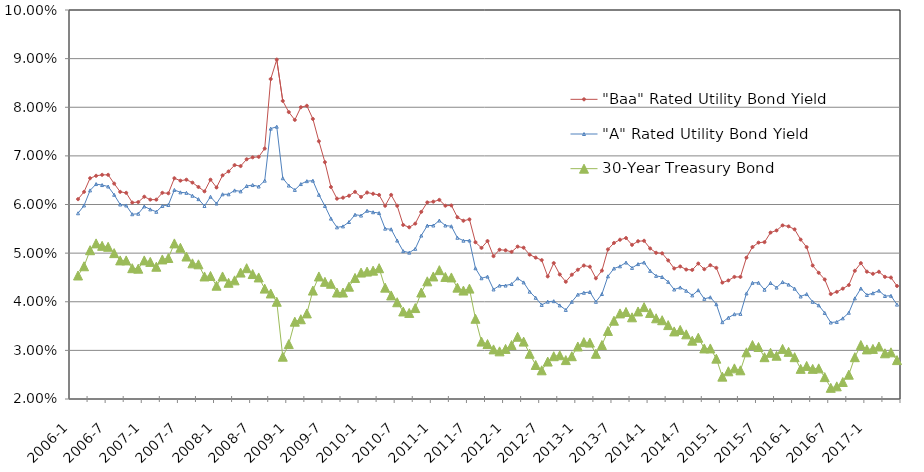
| Category | "Baa" Rated Utility Bond Yield | "A" Rated Utility Bond Yield | 30-Year Treasury Bond |
|---|---|---|---|
| 2006-02-01 | 0.061 | 0.058 | 0.045 |
| 2006-03-01 | 0.063 | 0.06 | 0.047 |
| 2006-04-01 | 0.065 | 0.063 | 0.051 |
| 2006-05-01 | 0.066 | 0.064 | 0.052 |
| 2006-06-01 | 0.066 | 0.064 | 0.052 |
| 2006-07-01 | 0.066 | 0.064 | 0.051 |
| 2006-08-01 | 0.064 | 0.062 | 0.05 |
| 2006-09-01 | 0.063 | 0.06 | 0.048 |
| 2006-10-01 | 0.062 | 0.06 | 0.048 |
| 2006-11-01 | 0.06 | 0.058 | 0.047 |
| 2006-12-01 | 0.06 | 0.058 | 0.047 |
| 2007-01-01 | 0.062 | 0.06 | 0.048 |
| 2007-02-01 | 0.061 | 0.059 | 0.048 |
| 2007-03-01 | 0.061 | 0.058 | 0.047 |
| 2007-04-01 | 0.062 | 0.06 | 0.049 |
| 2007-05-01 | 0.062 | 0.06 | 0.049 |
| 2007-06-01 | 0.065 | 0.063 | 0.052 |
| 2007-07-01 | 0.065 | 0.062 | 0.051 |
| 2007-08-01 | 0.065 | 0.062 | 0.049 |
| 2007-09-01 | 0.064 | 0.062 | 0.048 |
| 2007-10-01 | 0.064 | 0.061 | 0.048 |
| 2007-11-01 | 0.063 | 0.06 | 0.045 |
| 2007-12-01 | 0.065 | 0.062 | 0.045 |
| 2008-01-01 | 0.064 | 0.06 | 0.043 |
| 2008-02-01 | 0.066 | 0.062 | 0.045 |
| 2008-03-01 | 0.067 | 0.062 | 0.044 |
| 2008-04-01 | 0.068 | 0.063 | 0.044 |
| 2008-05-01 | 0.068 | 0.063 | 0.046 |
| 2008-06-01 | 0.069 | 0.064 | 0.047 |
| 2008-07-01 | 0.07 | 0.064 | 0.046 |
| 2008-08-01 | 0.07 | 0.064 | 0.045 |
| 2008-09-01 | 0.072 | 0.065 | 0.043 |
| 2008-10-01 | 0.086 | 0.076 | 0.042 |
| 2008-11-01 | 0.09 | 0.076 | 0.04 |
| 2008-12-01 | 0.081 | 0.065 | 0.029 |
| 2009-01-01 | 0.079 | 0.064 | 0.031 |
| 2009-02-01 | 0.077 | 0.063 | 0.036 |
| 2009-03-01 | 0.08 | 0.064 | 0.036 |
| 2009-04-01 | 0.08 | 0.065 | 0.038 |
| 2009-05-01 | 0.078 | 0.065 | 0.042 |
| 2009-06-01 | 0.073 | 0.062 | 0.045 |
| 2009-07-01 | 0.069 | 0.06 | 0.044 |
| 2009-08-01 | 0.064 | 0.057 | 0.044 |
| 2009-09-01 | 0.061 | 0.055 | 0.042 |
| 2009-10-01 | 0.061 | 0.056 | 0.042 |
| 2009-11-01 | 0.062 | 0.056 | 0.043 |
| 2009-12-01 | 0.063 | 0.058 | 0.045 |
| 2010-01-01 | 0.062 | 0.058 | 0.046 |
| 2010-02-01 | 0.062 | 0.059 | 0.046 |
| 2010-03-01 | 0.062 | 0.058 | 0.046 |
| 2010-04-01 | 0.062 | 0.058 | 0.047 |
| 2010-05-01 | 0.06 | 0.055 | 0.043 |
| 2010-06-01 | 0.062 | 0.055 | 0.041 |
| 2010-07-01 | 0.06 | 0.053 | 0.04 |
| 2010-08-01 | 0.056 | 0.05 | 0.038 |
| 2010-09-01 | 0.055 | 0.05 | 0.038 |
| 2010-10-01 | 0.056 | 0.051 | 0.039 |
| 2010-11-01 | 0.058 | 0.054 | 0.042 |
| 2010-12-01 | 0.06 | 0.056 | 0.044 |
| 2011-01-01 | 0.061 | 0.056 | 0.045 |
| 2011-02-01 | 0.061 | 0.057 | 0.047 |
| 2011-03-01 | 0.06 | 0.056 | 0.045 |
| 2011-04-01 | 0.06 | 0.056 | 0.045 |
| 2011-05-01 | 0.057 | 0.053 | 0.043 |
| 2011-06-01 | 0.057 | 0.053 | 0.042 |
| 2011-07-01 | 0.057 | 0.053 | 0.043 |
| 2011-08-01 | 0.052 | 0.047 | 0.036 |
| 2011-09-01 | 0.051 | 0.045 | 0.032 |
| 2011-10-01 | 0.052 | 0.045 | 0.031 |
| 2011-11-01 | 0.049 | 0.043 | 0.03 |
| 2011-12-01 | 0.051 | 0.043 | 0.03 |
| 2012-01-01 | 0.051 | 0.043 | 0.03 |
| 2012-02-01 | 0.05 | 0.044 | 0.031 |
| 2012-03-01 | 0.051 | 0.045 | 0.033 |
| 2012-04-01 | 0.051 | 0.044 | 0.032 |
| 2012-05-01 | 0.05 | 0.042 | 0.029 |
| 2012-06-01 | 0.049 | 0.041 | 0.027 |
| 2012-07-01 | 0.049 | 0.039 | 0.026 |
| 2012-08-01 | 0.045 | 0.04 | 0.028 |
| 2012-09-01 | 0.048 | 0.04 | 0.029 |
| 2012-10-01 | 0.046 | 0.039 | 0.029 |
| 2012-11-01 | 0.044 | 0.038 | 0.028 |
| 2012-12-01 | 0.046 | 0.04 | 0.029 |
| 2013-01-01 | 0.047 | 0.041 | 0.031 |
| 2013-02-01 | 0.047 | 0.042 | 0.032 |
| 2013-03-01 | 0.047 | 0.042 | 0.032 |
| 2013-04-01 | 0.045 | 0.04 | 0.029 |
| 2013-05-01 | 0.046 | 0.042 | 0.031 |
| 2013-06-01 | 0.051 | 0.045 | 0.034 |
| 2013-07-01 | 0.052 | 0.047 | 0.036 |
| 2013-08-01 | 0.053 | 0.047 | 0.038 |
| 2013-09-01 | 0.053 | 0.048 | 0.038 |
| 2013-10-01 | 0.052 | 0.047 | 0.037 |
| 2013-11-01 | 0.052 | 0.048 | 0.038 |
| 2013-12-01 | 0.053 | 0.048 | 0.039 |
| 2014-01-01 | 0.051 | 0.046 | 0.038 |
| 2014-02-01 | 0.05 | 0.045 | 0.037 |
| 2014-03-01 | 0.05 | 0.045 | 0.036 |
| 2014-04-01 | 0.049 | 0.044 | 0.035 |
| 2014-05-01 | 0.047 | 0.043 | 0.034 |
| 2014-06-01 | 0.047 | 0.043 | 0.034 |
| 2014-07-01 | 0.047 | 0.042 | 0.033 |
| 2014-08-01 | 0.047 | 0.041 | 0.032 |
| 2014-09-01 | 0.048 | 0.042 | 0.033 |
| 2014-10-01 | 0.047 | 0.041 | 0.03 |
| 2014-11-01 | 0.048 | 0.041 | 0.03 |
| 2014-12-01 | 0.047 | 0.039 | 0.028 |
| 2015-01-01 | 0.044 | 0.036 | 0.025 |
| 2015-02-01 | 0.044 | 0.037 | 0.026 |
| 2015-03-01 | 0.045 | 0.037 | 0.026 |
| 2015-04-01 | 0.045 | 0.038 | 0.026 |
| 2015-05-01 | 0.049 | 0.042 | 0.03 |
| 2015-06-01 | 0.051 | 0.044 | 0.031 |
| 2015-07-01 | 0.052 | 0.044 | 0.031 |
| 2015-08-01 | 0.052 | 0.042 | 0.029 |
| 2015-09-01 | 0.054 | 0.044 | 0.03 |
| 2015-10-01 | 0.055 | 0.043 | 0.029 |
| 2015-11-01 | 0.056 | 0.044 | 0.03 |
| 2015-12-01 | 0.056 | 0.044 | 0.03 |
| 2016-01-01 | 0.055 | 0.043 | 0.029 |
| 2016-02-01 | 0.053 | 0.041 | 0.026 |
| 2016-03-01 | 0.051 | 0.042 | 0.027 |
| 2016-04-01 | 0.047 | 0.04 | 0.026 |
| 2016-05-01 | 0.046 | 0.039 | 0.026 |
| 2016-06-01 | 0.045 | 0.038 | 0.024 |
| 2016-07-01 | 0.042 | 0.036 | 0.022 |
| 2016-08-01 | 0.042 | 0.036 | 0.023 |
| 2016-09-01 | 0.043 | 0.037 | 0.024 |
| 2016-10-01 | 0.043 | 0.038 | 0.025 |
| 2016-11-01 | 0.046 | 0.041 | 0.029 |
| 2016-12-01 | 0.048 | 0.043 | 0.031 |
| 2017-01-01 | 0.046 | 0.041 | 0.03 |
| 2017-02-01 | 0.046 | 0.042 | 0.03 |
| 2017-03-01 | 0.046 | 0.042 | 0.031 |
| 2017-04-01 | 0.045 | 0.041 | 0.029 |
| 2017-05-01 | 0.045 | 0.041 | 0.03 |
| 2017-06-01 | 0.043 | 0.039 | 0.028 |